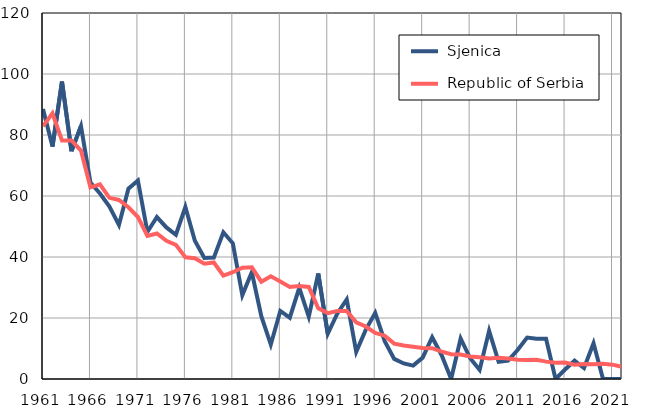
| Category |  Sjenica |  Republic of Serbia |
|---|---|---|
| 1961.0 | 88.5 | 82.9 |
| 1962.0 | 76.2 | 87.1 |
| 1963.0 | 97.5 | 78.2 |
| 1964.0 | 74.7 | 78.2 |
| 1965.0 | 82.9 | 74.9 |
| 1966.0 | 64.4 | 62.8 |
| 1967.0 | 60.8 | 63.8 |
| 1968.0 | 56.5 | 59.4 |
| 1969.0 | 50.5 | 58.7 |
| 1970.0 | 62.4 | 56.3 |
| 1971.0 | 65.1 | 53.1 |
| 1972.0 | 48.2 | 46.9 |
| 1973.0 | 53.1 | 47.7 |
| 1974.0 | 49.7 | 45.3 |
| 1975.0 | 47.3 | 44 |
| 1976.0 | 56.4 | 39.9 |
| 1977.0 | 45.3 | 39.6 |
| 1978.0 | 39.7 | 37.8 |
| 1979.0 | 39.8 | 38.2 |
| 1980.0 | 48.1 | 33.9 |
| 1981.0 | 44.5 | 35 |
| 1982.0 | 27.5 | 36.5 |
| 1983.0 | 35 | 36.6 |
| 1984.0 | 20.6 | 31.9 |
| 1985.0 | 11.3 | 33.7 |
| 1986.0 | 22.3 | 32 |
| 1987.0 | 20.1 | 30.2 |
| 1988.0 | 29.9 | 30.5 |
| 1989.0 | 20.4 | 30.2 |
| 1990.0 | 34.6 | 23.2 |
| 1991.0 | 14.8 | 21.6 |
| 1992.0 | 21.4 | 22.3 |
| 1993.0 | 26.1 | 22.3 |
| 1994.0 | 8.9 | 18.6 |
| 1995.0 | 16.1 | 17.2 |
| 1996.0 | 21.7 | 15.1 |
| 1997.0 | 12.4 | 14.2 |
| 1998.0 | 6.6 | 11.6 |
| 1999.0 | 5.1 | 11 |
| 2000.0 | 4.4 | 10.6 |
| 2001.0 | 7 | 10.2 |
| 2002.0 | 13.7 | 10.1 |
| 2003.0 | 7.8 | 9 |
| 2004.0 | 0 | 8.1 |
| 2005.0 | 13.3 | 8 |
| 2006.0 | 6.8 | 7.4 |
| 2007.0 | 3 | 7.1 |
| 2008.0 | 15.8 | 6.7 |
| 2009.0 | 5.6 | 7 |
| 2010.0 | 6 | 6.7 |
| 2011.0 | 9.5 | 6.3 |
| 2012.0 | 13.6 | 6.2 |
| 2013.0 | 13.2 | 6.3 |
| 2014.0 | 13.2 | 5.7 |
| 2015.0 | 0 | 5.3 |
| 2016.0 | 3.1 | 5.4 |
| 2017.0 | 6 | 4.7 |
| 2018.0 | 3.6 | 4.9 |
| 2019.0 | 11.7 | 4.8 |
| 2020.0 | 0 | 5 |
| 2021.0 | 0 | 4.7 |
| 2022.0 | 0 | 4 |